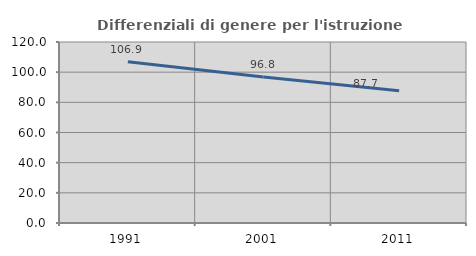
| Category | Differenziali di genere per l'istruzione superiore |
|---|---|
| 1991.0 | 106.867 |
| 2001.0 | 96.81 |
| 2011.0 | 87.713 |